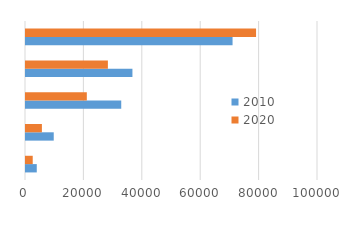
| Category | 2010 | 2020 |
|---|---|---|
| moins de 50 | 3689 | 2302 |
| de 50 à 99 | 9500 | 5445 |
| de 100 à 199 | 32615 | 20829 |
| de 200 à 299 | 36449 | 28044 |
| 300 ou plus | 70738 | 78785 |